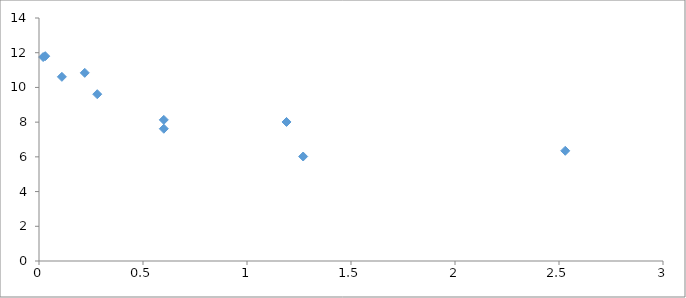
| Category | Series 0 |
|---|---|
| 0.22 | 10.84 |
| 1.19 | 8.01 |
| 2.53 | 6.35 |
| 0.03 | 11.8 |
| 0.11 | 10.61 |
| 0.6 | 7.62 |
| 1.27 | 6.02 |
| 0.6 | 8.13 |
| 0.02 | 11.75 |
| 0.28 | 9.61 |